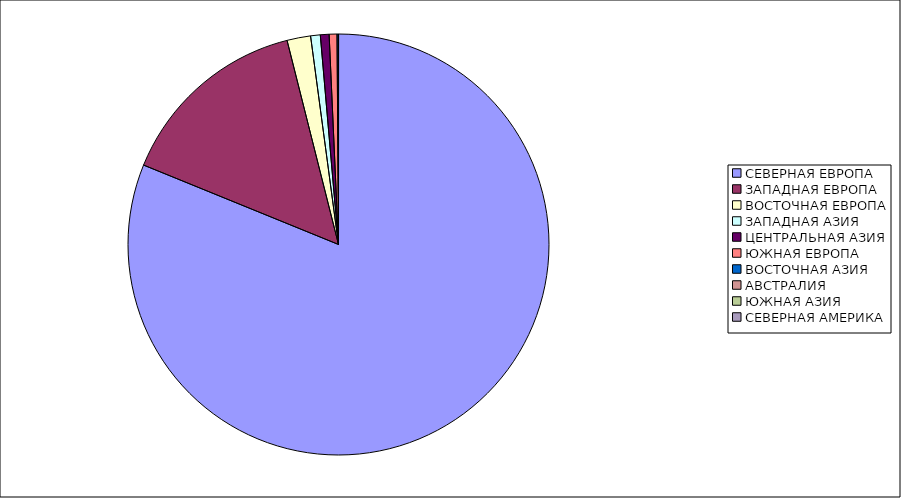
| Category | Оборот |
|---|---|
| СЕВЕРНАЯ ЕВРОПА | 81.15 |
| ЗАПАДНАЯ ЕВРОПА | 14.91 |
| ВОСТОЧНАЯ ЕВРОПА | 1.81 |
| ЗАПАДНАЯ АЗИЯ | 0.74 |
| ЦЕНТРАЛЬНАЯ АЗИЯ | 0.67 |
| ЮЖНАЯ ЕВРОПА | 0.6 |
| ВОСТОЧНАЯ АЗИЯ | 0.11 |
| АВСТРАЛИЯ | 0 |
| ЮЖНАЯ АЗИЯ | 0 |
| СЕВЕРНАЯ АМЕРИКА | 0 |